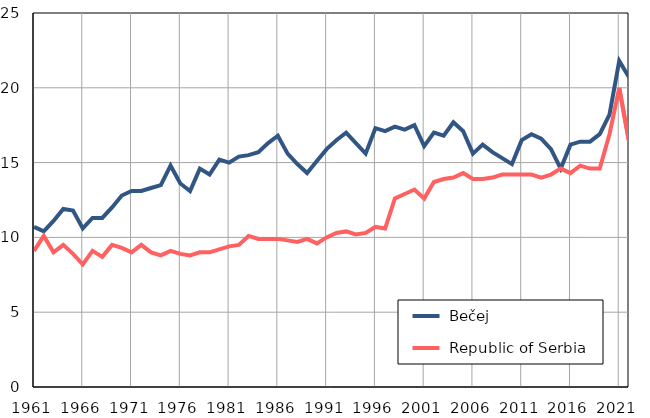
| Category |  Bečej |  Republic of Serbia |
|---|---|---|
| 1961.0 | 10.7 | 9.1 |
| 1962.0 | 10.4 | 10.1 |
| 1963.0 | 11.1 | 9 |
| 1964.0 | 11.9 | 9.5 |
| 1965.0 | 11.8 | 8.9 |
| 1966.0 | 10.6 | 8.2 |
| 1967.0 | 11.3 | 9.1 |
| 1968.0 | 11.3 | 8.7 |
| 1969.0 | 12 | 9.5 |
| 1970.0 | 12.8 | 9.3 |
| 1971.0 | 13.1 | 9 |
| 1972.0 | 13.1 | 9.5 |
| 1973.0 | 13.3 | 9 |
| 1974.0 | 13.5 | 8.8 |
| 1975.0 | 14.8 | 9.1 |
| 1976.0 | 13.6 | 8.9 |
| 1977.0 | 13.1 | 8.8 |
| 1978.0 | 14.6 | 9 |
| 1979.0 | 14.2 | 9 |
| 1980.0 | 15.2 | 9.2 |
| 1981.0 | 15 | 9.4 |
| 1982.0 | 15.4 | 9.5 |
| 1983.0 | 15.5 | 10.1 |
| 1984.0 | 15.7 | 9.9 |
| 1985.0 | 16.3 | 9.9 |
| 1986.0 | 16.8 | 9.9 |
| 1987.0 | 15.6 | 9.8 |
| 1988.0 | 14.9 | 9.7 |
| 1989.0 | 14.3 | 9.9 |
| 1990.0 | 15.1 | 9.6 |
| 1991.0 | 15.9 | 10 |
| 1992.0 | 16.5 | 10.3 |
| 1993.0 | 17 | 10.4 |
| 1994.0 | 16.3 | 10.2 |
| 1995.0 | 15.6 | 10.3 |
| 1996.0 | 17.3 | 10.7 |
| 1997.0 | 17.1 | 10.6 |
| 1998.0 | 17.4 | 12.6 |
| 1999.0 | 17.2 | 12.9 |
| 2000.0 | 17.5 | 13.2 |
| 2001.0 | 16.1 | 12.6 |
| 2002.0 | 17 | 13.7 |
| 2003.0 | 16.8 | 13.9 |
| 2004.0 | 17.7 | 14 |
| 2005.0 | 17.1 | 14.3 |
| 2006.0 | 15.6 | 13.9 |
| 2007.0 | 16.2 | 13.9 |
| 2008.0 | 15.7 | 14 |
| 2009.0 | 15.3 | 14.2 |
| 2010.0 | 14.9 | 14.2 |
| 2011.0 | 16.5 | 14.2 |
| 2012.0 | 16.9 | 14.2 |
| 2013.0 | 16.6 | 14 |
| 2014.0 | 15.9 | 14.2 |
| 2015.0 | 14.6 | 14.6 |
| 2016.0 | 16.2 | 14.3 |
| 2017.0 | 16.4 | 14.8 |
| 2018.0 | 16.4 | 14.6 |
| 2019.0 | 16.9 | 14.6 |
| 2020.0 | 18.2 | 16.9 |
| 2021.0 | 21.8 | 20 |
| 2022.0 | 20.7 | 16.4 |